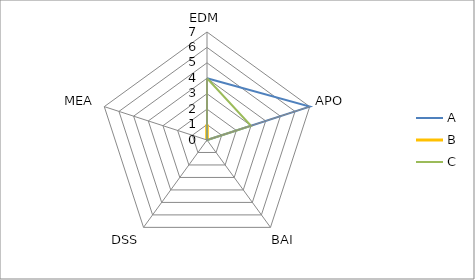
| Category | A | B | C |
|---|---|---|---|
| 0 | 4 | 1 | 4 |
| 1 | 7 | 0 | 3 |
| 2 | 0 | 0 | 0 |
| 3 | 0 | 0 | 0 |
| 4 | 0 | 0 | 0 |